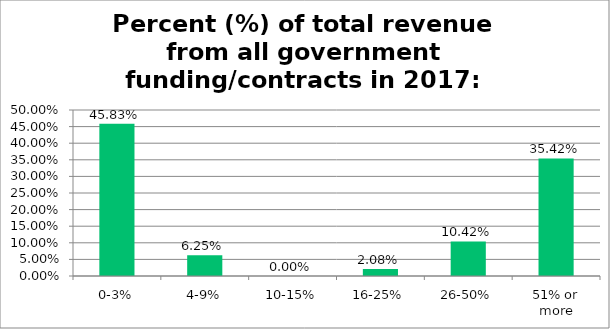
| Category | Responses |
|---|---|
| 0-3% | 0.458 |
| 4-9% | 0.062 |
| 10-15% | 0 |
| 16-25% | 0.021 |
| 26-50% | 0.104 |
| 51% or more | 0.354 |